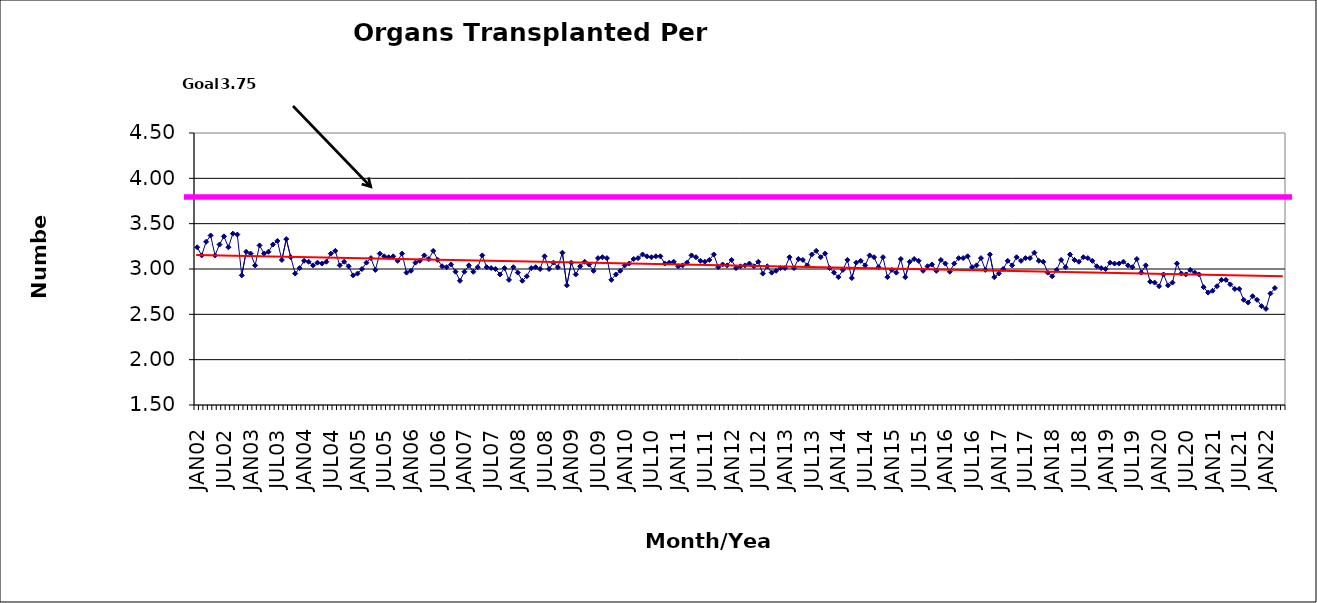
| Category | Series 0 |
|---|---|
| JAN02 | 3.24 |
| FEB02 | 3.15 |
| MAR02 | 3.3 |
| APR02 | 3.37 |
| MAY02 | 3.15 |
| JUN02 | 3.27 |
| JUL02 | 3.36 |
| AUG02 | 3.24 |
| SEP02 | 3.39 |
| OCT02 | 3.38 |
| NOV02 | 2.93 |
| DEC02 | 3.19 |
| JAN03 | 3.17 |
| FEB03 | 3.04 |
| MAR03 | 3.26 |
| APR03 | 3.17 |
| MAY03 | 3.19 |
| JUN03 | 3.27 |
| JUL03 | 3.31 |
| AUG03 | 3.1 |
| SEP03 | 3.33 |
| OCT03 | 3.13 |
| NOV03 | 2.95 |
| DEC03 | 3.01 |
| JAN04 | 3.09 |
| FEB04 | 3.08 |
| MAR04 | 3.04 |
| APR04 | 3.07 |
| MAY04 | 3.06 |
| JUN04 | 3.08 |
| JUL04 | 3.17 |
| AUG04 | 3.2 |
| SEP04 | 3.04 |
| OCT04 | 3.08 |
| NOV04 | 3.03 |
| DEC04 | 2.93 |
| JAN05 | 2.95 |
| FEB05 | 3 |
| MAR05 | 3.07 |
| APR05 | 3.12 |
| MAY05 | 2.99 |
| JUN05 | 3.17 |
| JUL05 | 3.14 |
| AUG05 | 3.13 |
| SEP05 | 3.14 |
| OCT05 | 3.09 |
| NOV05 | 3.17 |
| DEC05 | 2.96 |
| JAN06 | 2.98 |
| FEB06 | 3.07 |
| MAR06 | 3.09 |
| APR06 | 3.15 |
| MAY06 | 3.11 |
| JUN06 | 3.2 |
| JUL06 | 3.1 |
| AUG06 | 3.03 |
| SEP06 | 3.02 |
| OCT06 | 3.05 |
| NOV06 | 2.97 |
| DEC06 | 2.87 |
| JAN07 | 2.97 |
| FEB07 | 3.04 |
| MAR07 | 2.97 |
| APR07 | 3.02 |
| MAY07 | 3.15 |
| JUN07 | 3.02 |
| JUL07 | 3.01 |
| AUG07 | 3 |
| SEP07 | 2.94 |
| OCT07 | 3.01 |
| NOV07 | 2.88 |
| DEC07 | 3.02 |
| JAN08 | 2.96 |
| FEB08 | 2.87 |
| MAR08 | 2.92 |
| APR08 | 3.01 |
| MAY08 | 3.02 |
| JUN08 | 3 |
| JUL08 | 3.14 |
| AUG08 | 3 |
| SEP08 | 3.07 |
| OCT08 | 3.02 |
| NOV08 | 3.18 |
| DEC08 | 2.82 |
| JAN09 | 3.07 |
| FEB09 | 2.94 |
| MAR09 | 3.03 |
| APR09 | 3.08 |
| MAY09 | 3.05 |
| JUN09 | 2.98 |
| JUL09 | 3.12 |
| AUG09 | 3.13 |
| SEP09 | 3.12 |
| OCT09 | 2.88 |
| NOV09 | 2.94 |
| DEC09 | 2.98 |
| JAN10 | 3.04 |
| FEB10 | 3.06 |
| MAR10 | 3.11 |
| APR10 | 3.12 |
| MAY10 | 3.16 |
| JUN10 | 3.14 |
| JUL10 | 3.13 |
| AUG10 | 3.14 |
| SEP10 | 3.14 |
| OCT10 | 3.06 |
| NOV10 | 3.07 |
| DEC10 | 3.08 |
| JAN11 | 3.03 |
| FEB11 | 3.04 |
| MAR11 | 3.07 |
| APR11 | 3.15 |
| MAY11 | 3.13 |
| JUN11 | 3.09 |
| JUL11 | 3.08 |
| AUG11 | 3.1 |
| SEP11 | 3.16 |
| OCT11 | 3.02 |
| NOV11 | 3.05 |
| DEC11 | 3.04 |
| JAN12 | 3.1 |
| FEB12 | 3.01 |
| MAR12 | 3.03 |
| APR12 | 3.04 |
| MAY12 | 3.06 |
| JUN12 | 3.03 |
| JUL12 | 3.08 |
| AUG12 | 2.95 |
| SEP12 | 3.03 |
| OCT12 | 2.96 |
| NOV12 | 2.98 |
| DEC12 | 3.01 |
| JAN13 | 3.01 |
| FEB13 | 3.13 |
| MAR13 | 3.01 |
| APR13 | 3.11 |
| MAY13 | 3.1 |
| JUN13 | 3.04 |
| JUL13 | 3.16 |
| AUG13 | 3.2 |
| SEP13 | 3.13 |
| OCT13 | 3.17 |
| NOV13 | 3.01 |
| DEC13 | 2.96 |
| JAN14 | 2.91 |
| FEB14 | 2.99 |
| MAR14 | 3.1 |
| APR14 | 2.9 |
| MAY14 | 3.07 |
| JUN14 | 3.09 |
| JUL14 | 3.04 |
| AUG14 | 3.15 |
| SEP14 | 3.13 |
| OCT14 | 3.02 |
| NOV14 | 3.13 |
| DEC14 | 2.91 |
| JAN15 | 2.99 |
| FEB15 | 2.96 |
| MAR15 | 3.11 |
| APR15 | 2.91 |
| MAY15 | 3.08 |
| JUN15 | 3.11 |
| JUL15 | 3.09 |
| AUG15 | 2.98 |
| SEP15 | 3.03 |
| OCT15 | 3.05 |
| NOV15 | 2.98 |
| DEC15 | 3.1 |
| JAN16 | 3.06 |
| FEB16 | 2.97 |
| MAR16 | 3.06 |
| APR16 | 3.12 |
| MAY16 | 3.12 |
| JUN16 | 3.14 |
| JUL16 | 3.02 |
| AUG16 | 3.04 |
| SEP16 | 3.12 |
| OCT16 | 2.99 |
| NOV16 | 3.16 |
| DEC16 | 2.91 |
| JAN17 | 2.95 |
| FEB17 | 3 |
| MAR17 | 3.09 |
| APR17 | 3.04 |
| MAY17 | 3.13 |
| JUN17 | 3.09 |
| JUL17 | 3.12 |
| AUG17 | 3.12 |
| SEP17 | 3.18 |
| OCT17 | 3.09 |
| NOV17 | 3.08 |
| DEC17 | 2.96 |
| JAN18 | 2.92 |
| FEB18 | 2.99 |
| MAR18 | 3.1 |
| APR18 | 3.02 |
| MAY18 | 3.16 |
| JUN18 | 3.1 |
| JUL18 | 3.08 |
| AUG18 | 3.13 |
| SEP18 | 3.12 |
| OCT18 | 3.09 |
| NOV18 | 3.03 |
| DEC18 | 3.01 |
| JAN19 | 3 |
| FEB19 | 3.07 |
| MAR19 | 3.06 |
| APR19 | 3.06 |
| MAY19 | 3.08 |
| JUN19 | 3.04 |
| JUL19 | 3.02 |
| AUG19 | 3.11 |
| SEP19 | 2.96 |
| OCT19 | 3.04 |
| NOV19 | 2.86 |
| DEC19 | 2.85 |
| JAN20 | 2.81 |
| FEB20 | 2.94 |
| MAR20 | 2.82 |
| APR20 | 2.85 |
| MAY20 | 3.06 |
| JUN20 | 2.95 |
| JUL20 | 2.94 |
| AUG20 | 2.99 |
| SEP20 | 2.96 |
| OCT20 | 2.94 |
| NOV20 | 2.8 |
| DEC20 | 2.74 |
| JAN21 | 2.76 |
| FEB21 | 2.81 |
| MAR21 | 2.88 |
| APR21 | 2.88 |
| MAY21 | 2.83 |
| JUN21 | 2.78 |
| JUL21 | 2.78 |
| AUG21 | 2.66 |
| SEP21 | 2.63 |
| OCT21 | 2.7 |
| NOV21 | 2.66 |
| DEC21 | 2.59 |
| JAN22 | 2.56 |
| FEB22 | 2.73 |
| MAR22 | 2.79 |